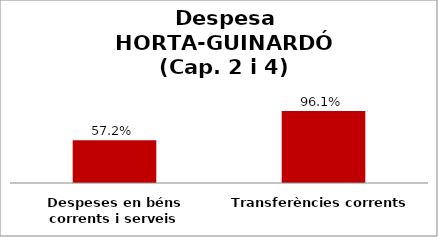
| Category | Series 0 |
|---|---|
| Despeses en béns corrents i serveis | 0.572 |
| Transferències corrents | 0.961 |